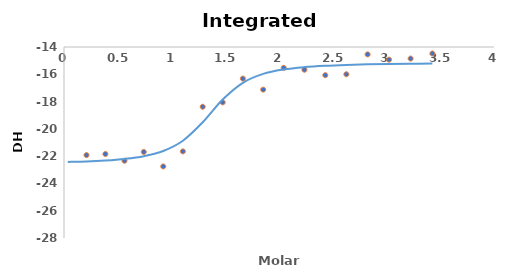
| Category | Real Data |
|---|---|
| 0.209088 | -21.924 |
| 0.385146 | -21.844 |
| 0.562855 | -22.339 |
| 0.742215 | -21.692 |
| 0.923225 | -22.754 |
| 1.105886 | -21.651 |
| 1.290199 | -18.381 |
| 1.476162 | -18.06 |
| 1.663776 | -16.315 |
| 1.853041 | -17.125 |
| 2.043956 | -15.528 |
| 2.236523 | -15.665 |
| 2.43074 | -16.066 |
| 2.626609 | -15.998 |
| 2.824128 | -14.542 |
| 3.023298 | -14.929 |
| 3.224119 | -14.848 |
| 3.426591 | -14.478 |